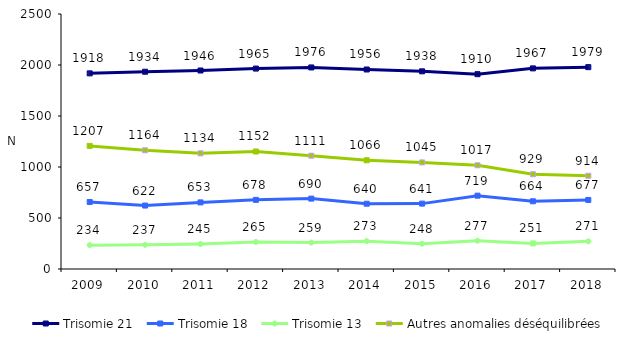
| Category | Trisomie 21 | Trisomie 18 | Trisomie 13 | Autres anomalies déséquilibrées |
|---|---|---|---|---|
| 2009.0 | 1918 | 657 | 234 | 1207 |
| 2010.0 | 1934 | 622 | 237 | 1164 |
| 2011.0 | 1946 | 653 | 245 | 1134 |
| 2012.0 | 1965 | 678 | 265 | 1152 |
| 2013.0 | 1976 | 690 | 259 | 1111 |
| 2014.0 | 1956 | 640 | 273 | 1066 |
| 2015.0 | 1938 | 641 | 248 | 1045 |
| 2016.0 | 1910 | 719 | 277 | 1017 |
| 2017.0 | 1967 | 664 | 251 | 929 |
| 2018.0 | 1979 | 677 | 271 | 914 |